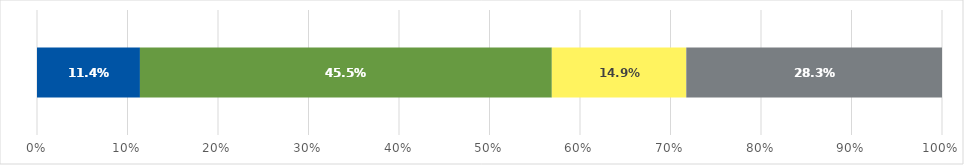
| Category | Renewable | Reciprocating Engine | Gas Turbine | Microturbine |
|---|---|---|---|---|
| 0 | 26.121 | 104.515 | 34.116 | 64.889 |